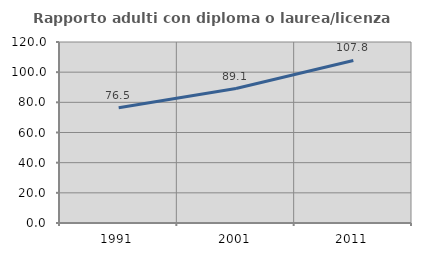
| Category | Rapporto adulti con diploma o laurea/licenza media  |
|---|---|
| 1991.0 | 76.471 |
| 2001.0 | 89.14 |
| 2011.0 | 107.778 |